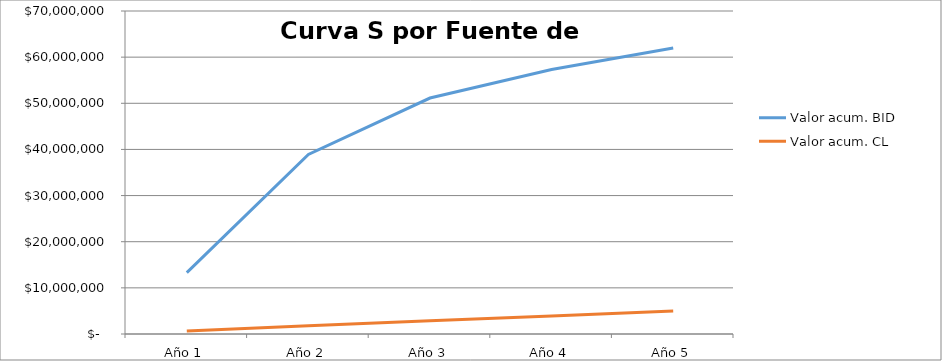
| Category | Valor acum. BID | Valor acum. CL |
|---|---|---|
| Año 1 | 13308715.3 | 625320 |
| Año 2 | 38925600 | 1780640 |
| Año 3 | 51142000 | 2853760 |
| Año 4 | 57323000 | 3926880 |
| Año 5 | 62000000 | 5000000 |